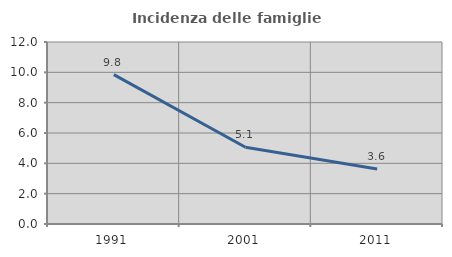
| Category | Incidenza delle famiglie numerose |
|---|---|
| 1991.0 | 9.845 |
| 2001.0 | 5.058 |
| 2011.0 | 3.62 |